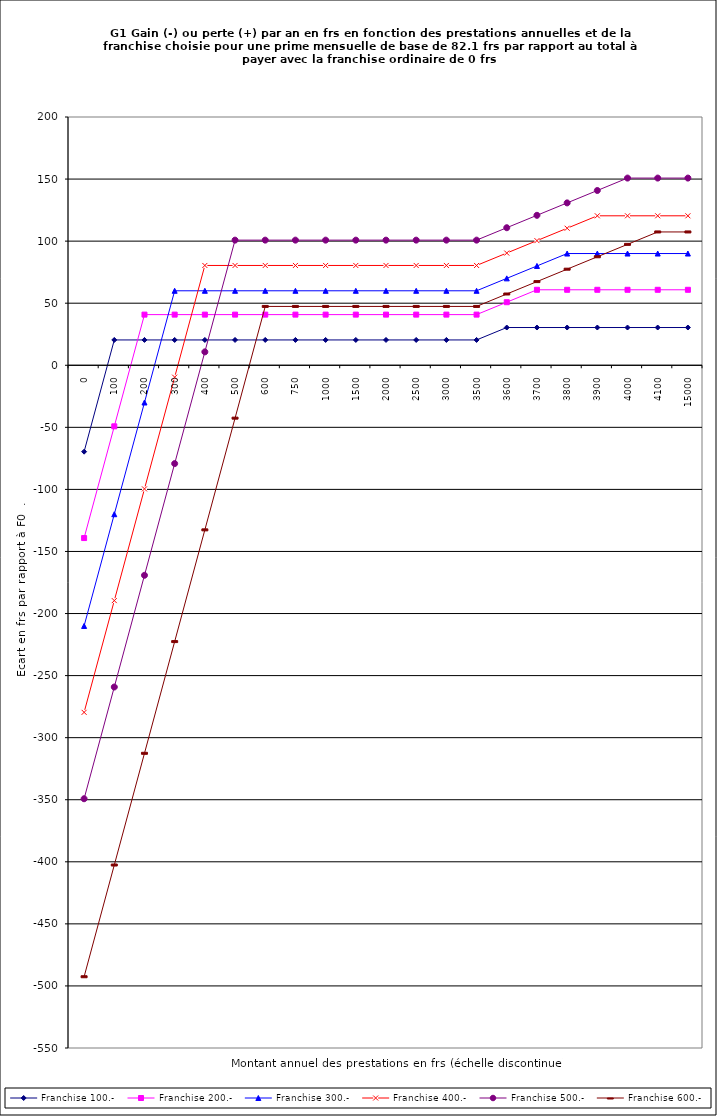
| Category | Franchise 100.- | Franchise 200.- | Franchise 300.- | Franchise 400.- | Franchise 500.- | Franchise 600.- |
|---|---|---|---|---|---|---|
| 0.0 | -69.6 | -139.2 | -210 | -279.6 | -349.2 | -492.6 |
| 100.0 | 20.4 | -49.2 | -120 | -189.6 | -259.2 | -402.6 |
| 200.0 | 20.4 | 40.8 | -30 | -99.6 | -169.2 | -312.6 |
| 300.0 | 20.4 | 40.8 | 60 | -9.6 | -79.2 | -222.6 |
| 400.0 | 20.4 | 40.8 | 60 | 80.4 | 10.8 | -132.6 |
| 500.0 | 20.4 | 40.8 | 60 | 80.4 | 100.8 | -42.6 |
| 600.0 | 20.4 | 40.8 | 60 | 80.4 | 100.8 | 47.4 |
| 750.0 | 20.4 | 40.8 | 60 | 80.4 | 100.8 | 47.4 |
| 1000.0 | 20.4 | 40.8 | 60 | 80.4 | 100.8 | 47.4 |
| 1500.0 | 20.4 | 40.8 | 60 | 80.4 | 100.8 | 47.4 |
| 2000.0 | 20.4 | 40.8 | 60 | 80.4 | 100.8 | 47.4 |
| 2500.0 | 20.4 | 40.8 | 60 | 80.4 | 100.8 | 47.4 |
| 3000.0 | 20.4 | 40.8 | 60 | 80.4 | 100.8 | 47.4 |
| 3500.0 | 20.4 | 40.8 | 60 | 80.4 | 100.8 | 47.4 |
| 3600.0 | 30.4 | 50.8 | 70 | 90.4 | 110.8 | 57.4 |
| 3700.0 | 30.4 | 60.8 | 80 | 100.4 | 120.8 | 67.4 |
| 3800.0 | 30.4 | 60.8 | 90 | 110.4 | 130.8 | 77.4 |
| 3900.0 | 30.4 | 60.8 | 90 | 120.4 | 140.8 | 87.4 |
| 4000.0 | 30.4 | 60.8 | 90 | 120.4 | 150.8 | 97.4 |
| 4100.0 | 30.4 | 60.8 | 90 | 120.4 | 150.8 | 107.4 |
| 15000.0 | 30.4 | 60.8 | 90 | 120.4 | 150.8 | 107.4 |